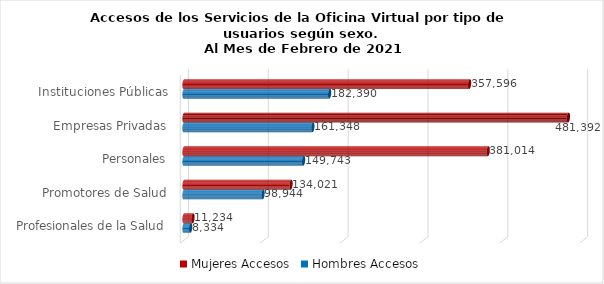
| Category | Mujeres | Hombres |
|---|---|---|
| Instituciones Públicas | 357596 | 182390 |
| Empresas Privadas | 481392 | 161348 |
| Personales | 381014 | 149743 |
| Promotores de Salud | 134021 | 98944 |
| Profesionales de la Salud | 11234 | 8334 |